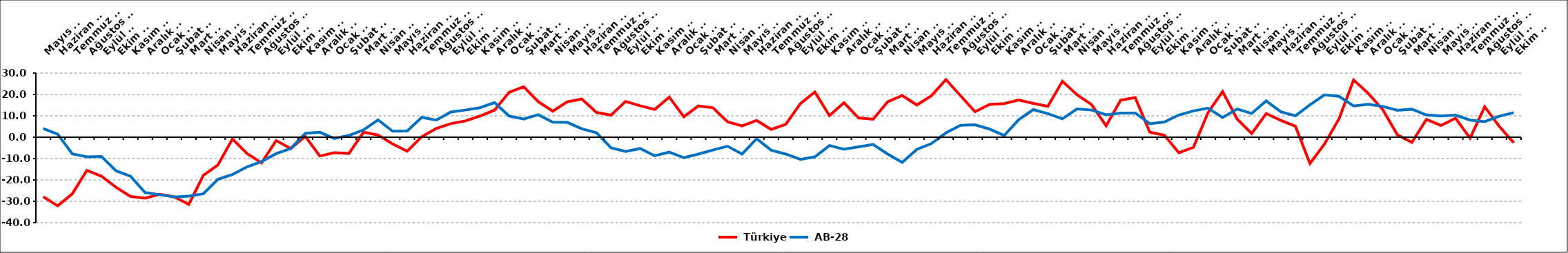
| Category |  Türkiye |  AB-28 |
|---|---|---|
| 2008-05-01 | -27.878 | 4.1 |
| 2008-06-01 | -32.136 | 1.4 |
| 2008-07-01 | -26.493 | -7.8 |
| 2008-08-01 | -15.555 | -9.2 |
| 2008-09-01 | -18.234 | -9 |
| 2008-10-01 | -23.433 | -15.7 |
| 2008-11-01 | -27.758 | -18.3 |
| 2008-12-01 | -28.539 | -25.9 |
| 2009-01-01 | -26.701 | -26.9 |
| 2009-02-01 | -27.909 | -28 |
| 2009-03-01 | -31.436 | -27.6 |
| 2009-04-01 | -17.883 | -26.5 |
| 2009-05-01 | -13.063 | -19.7 |
| 2009-06-01 | -0.811 | -17.5 |
| 2009-07-01 | -7.61 | -13.9 |
| 2009-08-01 | -12.044 | -11.4 |
| 2009-09-01 | -1.552 | -7.7 |
| 2009-10-01 | -5.355 | -5.3 |
| 2009-11-01 | 0.406 | 1.8 |
| 2009-12-01 | -8.817 | 2.3 |
| 2010-01-01 | -7.299 | -0.6 |
| 2010-02-01 | -7.613 | 0.8 |
| 2010-03-01 | 2.321 | 3.4 |
| 2010-04-01 | 1.029 | 8.1 |
| 2010-05-01 | -3.125 | 2.8 |
| 2010-06-01 | -6.58 | 2.9 |
| 2010-07-01 | 0.213 | 9.3 |
| 2010-08-01 | 4.11 | 8 |
| 2010-09-01 | 6.343 | 11.8 |
| 2010-10-01 | 7.629 | 12.7 |
| 2010-11-01 | 9.917 | 13.8 |
| 2010-12-01 | 12.671 | 16.2 |
| 2011-01-01 | 21.014 | 9.9 |
| 2011-02-01 | 23.572 | 8.5 |
| 2011-03-01 | 16.623 | 10.5 |
| 2011-04-01 | 12.169 | 7 |
| 2011-05-01 | 16.564 | 6.9 |
| 2011-06-01 | 17.834 | 3.9 |
| 2011-07-01 | 11.606 | 2.1 |
| 2011-08-01 | 10.306 | -5 |
| 2011-09-01 | 16.721 | -6.7 |
| 2011-10-01 | 14.724 | -5.3 |
| 2011-11-01 | 12.962 | -8.7 |
| 2011-12-01 | 18.754 | -7 |
| 2012-01-01 | 9.536 | -9.6 |
| 2012-02-01 | 14.631 | -7.9 |
| 2012-03-01 | 13.747 | -6 |
| 2012-04-01 | 7.194 | -4.2 |
| 2012-05-01 | 5.284 | -7.9 |
| 2012-06-01 | 7.83 | -0.7 |
| 2012-07-01 | 3.625 | -6.1 |
| 2012-08-01 | 5.985 | -7.9 |
| 2012-09-01 | 15.687 | -10.4 |
| 2012-10-01 | 21.157 | -9.2 |
| 2012-11-01 | 10.076 | -3.9 |
| 2012-12-01 | 16.116 | -5.6 |
| 2013-01-01 | 9 | -4.5 |
| 2013-02-01 | 8.387 | -3.4 |
| 2013-03-01 | 16.559 | -7.9 |
| 2013-04-01 | 19.52 | -11.8 |
| 2013-05-01 | 15.067 | -5.7 |
| 2013-06-01 | 19.379 | -3 |
| 2013-07-01 | 26.937 | 2 |
| 2013-08-01 | 19.429 | 5.6 |
| 2013-09-01 | 11.896 | 5.8 |
| 2013-10-01 | 15.357 | 3.8 |
| 2013-11-01 | 15.759 | 0.8 |
| 2013-12-01 | 17.439 | 8.2 |
| 2014-01-01 | 15.824 | 12.9 |
| 2014-02-01 | 14.469 | 11 |
| 2014-03-02 | 26.187 | 8.6 |
| 2014-04-02 | 19.844 | 13.2 |
| 2014-05-02 | 15.268 | 12.7 |
| 2014-06-02 | 5.339 | 10.5 |
| 2014-07-02 | 17.322 | 11.3 |
| 2014-08-02 | 18.575 | 11.3 |
| 2014-09-02 | 2.333 | 6.3 |
| 2014-10-02 | 0.96 | 7.1 |
| 2014-11-02 | -7.323 | 10.4 |
| 2014-12-02 | -4.754 | 12.3 |
| 2015-01-02 | 11.485 | 13.6 |
| 2015-02-02 | 21.323 | 9.2 |
| 2015-03-02 | 8.487 | 13.2 |
| 2015-04-02 | 1.683 | 11.1 |
| 2015-05-02 | 11.069 | 17 |
| 2015-06-02 | 7.857 | 11.9 |
| 2015-07-02 | 5.124 | 10 |
| 2015-08-02 | -12.286 | 15.1 |
| 2015-09-02 | -3.215 | 19.8 |
| 2015-10-02 | 8.664 | 19.1 |
| 2015-11-02 | 26.759 | 14.6 |
| 2015-12-02 | 20.519 | 15.4 |
| 2016-01-02 | 12.934 | 14.4 |
| 2016-02-02 | 1.145 | 12.6 |
| 2016-03-02 | -2.46 | 13.1 |
| 2016-04-02 | 8.307 | 10.4 |
| 2016-05-02 | 5.493 | 9.9 |
| 2016-06-02 | 8.882 | 10.3 |
| 2016-07-03 | -0.433 | 8 |
| 2016-08-03 | 14.254 | 7.3 |
| 2016-09-03 | 5.064 | 9.8 |
| 2016-10-03 | -2.604 | 11.5 |